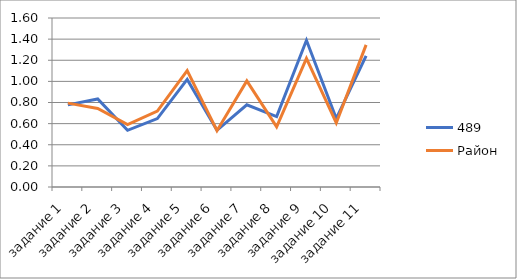
| Category | 489 | Район |
|---|---|---|
| задание 1 | 0.778 | 0.794 |
| задание 2 | 0.833 | 0.743 |
| задание 3 | 0.537 | 0.59 |
| задание 4 | 0.648 | 0.719 |
| задание 5 | 1.019 | 1.101 |
| задание 6 | 0.537 | 0.533 |
| задание 7 | 0.778 | 1.005 |
| задание 8 | 0.667 | 0.569 |
| задание 9 | 1.389 | 1.217 |
| задание 10 | 0.648 | 0.606 |
| задание 11 | 1.241 | 1.346 |